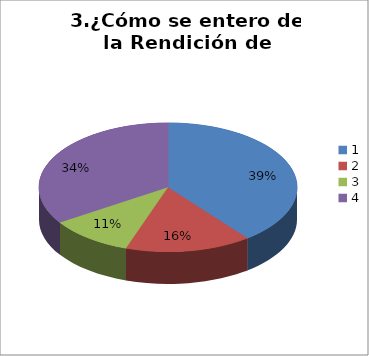
| Category | Series 0 |
|---|---|
| 0 | 15 |
| 1 | 6 |
| 2 | 4 |
| 3 | 13 |